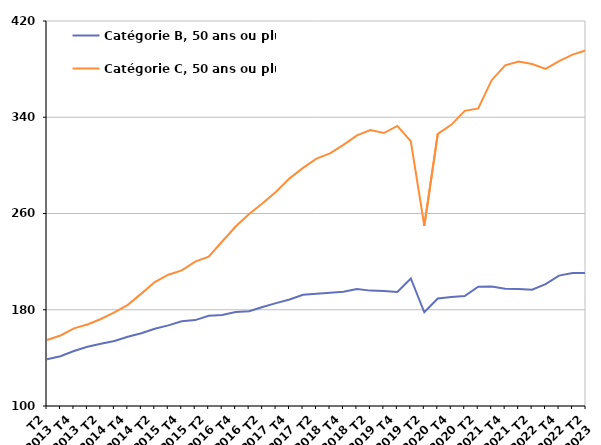
| Category | Catégorie B, 50 ans ou plus | Catégorie C, 50 ans ou plus |
|---|---|---|
| T2
2013 | 138.8 | 154.8 |
| T3
2013 | 141.4 | 158.6 |
| T4
2013 | 145.7 | 164.5 |
| T1
2014 | 149.2 | 167.7 |
| T2
2014 | 151.8 | 172.3 |
| T3
2014 | 154 | 177.9 |
| T4
2014 | 157.6 | 184.1 |
| T1
2015 | 160.5 | 193.4 |
| T2
2015 | 164.2 | 203 |
| T3
2015 | 167 | 209.1 |
| T4
2015 | 170.4 | 212.7 |
| T1
2016 | 171.4 | 220 |
| T2
2016 | 175 | 224.2 |
| T3
2016 | 175.7 | 236.7 |
| T4
2016 | 178.2 | 249.2 |
| T1
2017 | 178.8 | 259.6 |
| T2
2017 | 182.3 | 268.5 |
| T3
2017 | 185.5 | 278.1 |
| T4
2017 | 188.5 | 289.2 |
| T1
2018 | 192.4 | 297.9 |
| T2
2018 | 193.3 | 305.6 |
| T3
2018 | 194.2 | 310 |
| T4
2018 | 194.9 | 317 |
| T1
2019 | 197.3 | 324.9 |
| T2
2019 | 195.9 | 329.3 |
| T3
2019 | 195.5 | 326.9 |
| T4
2019 | 194.8 | 332.8 |
| T1
2020 | 206 | 320 |
| T2
2020 | 177.9 | 249.8 |
| T3
2020 | 189.3 | 326.2 |
| T4
2020 | 190.6 | 333.7 |
| T1
2021 | 191.4 | 345.3 |
| T2
2021 | 199.1 | 347.3 |
| T3
2021 | 199.3 | 370.8 |
| T4
2021 | 197.5 | 383.1 |
| T1
2022 | 197.3 | 386.3 |
| T2
2022 | 196.6 | 384.3 |
| T3
2022 | 201.3 | 380.2 |
| T4
2022 | 208.4 | 386.7 |
| T1
2023 | 210.6 | 392.1 |
| T2
2023 | 210.5 | 395.6 |